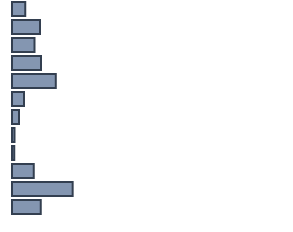
| Category | Series 0 |
|---|---|
| 0 | 4.9 |
| 1 | 10.3 |
| 2 | 8.3 |
| 3 | 10.7 |
| 4 | 16.1 |
| 5 | 4.4 |
| 6 | 2.6 |
| 7 | 0.9 |
| 8 | 0.8 |
| 9 | 8 |
| 10 | 22.3 |
| 11 | 10.6 |